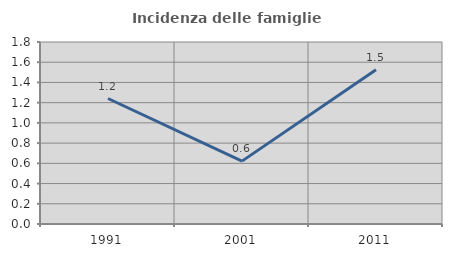
| Category | Incidenza delle famiglie numerose |
|---|---|
| 1991.0 | 1.241 |
| 2001.0 | 0.622 |
| 2011.0 | 1.524 |